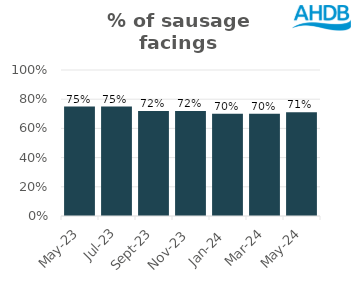
| Category | Sausage |
|---|---|
| 2023-05-01 | 0.75 |
| 2023-07-01 | 0.75 |
| 2023-09-01 | 0.72 |
| 2023-11-01 | 0.72 |
| 2024-01-01 | 0.7 |
| 2024-03-01 | 0.7 |
| 2024-05-01 | 0.71 |